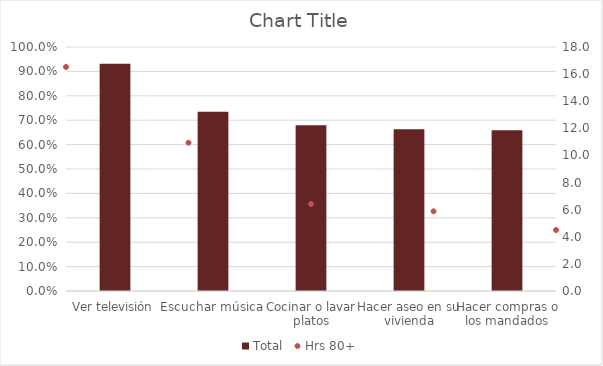
| Category | Total |
|---|---|
| Ver televisión | 0.932 |
| Escuchar música | 0.735 |
| Cocinar o lavar platos | 0.679 |
| Hacer aseo en su vivienda | 0.663 |
| Hacer compras o los mandados | 0.659 |